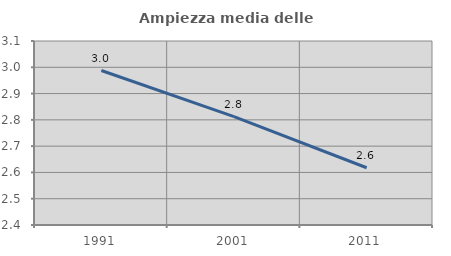
| Category | Ampiezza media delle famiglie |
|---|---|
| 1991.0 | 2.988 |
| 2001.0 | 2.812 |
| 2011.0 | 2.618 |